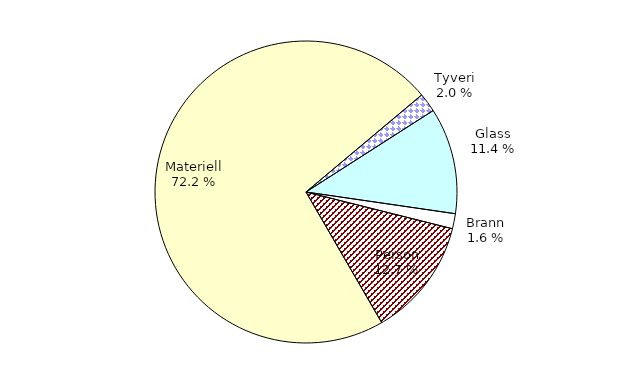
| Category | Series 0 |
|---|---|
| Tyveri | 187.939 |
| Glass | 1043.921 |
| Brann | 148.064 |
| Person | 1169.323 |
| Materiell | 6636.347 |